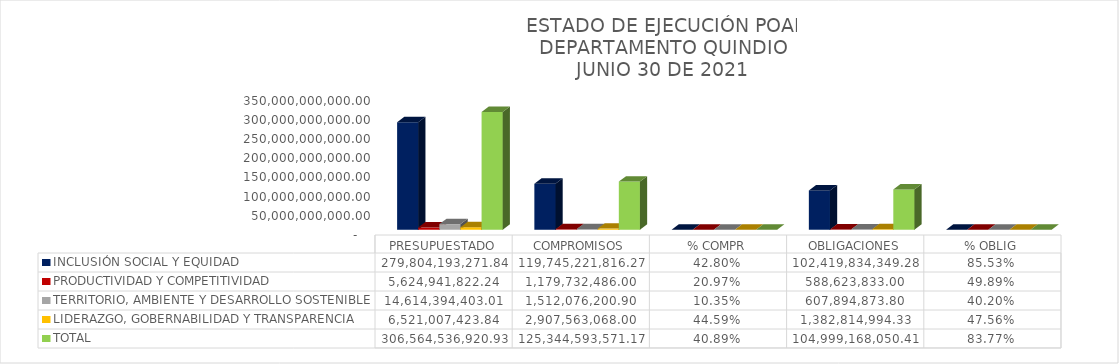
| Category | INCLUSIÓN SOCIAL Y EQUIDAD  | PRODUCTIVIDAD Y COMPETITIVIDAD | TERRITORIO, AMBIENTE Y DESARROLLO SOSTENIBLE  | LIDERAZGO, GOBERNABILIDAD Y TRANSPARENCIA  | TOTAL |
|---|---|---|---|---|---|
| PRESUPUESTADO | 279804193271.84 | 5624941822.24 | 14614394403.01 | 6521007423.84 | 306564536920.93 |
| COMPROMISOS | 119745221816.27 | 1179732486 | 1512076200.9 | 2907563068 | 125344593571.17 |
| % COMPR | 0.428 | 0.21 | 0.103 | 0.446 | 0.409 |
| OBLIGACIONES | 102419834349.28 | 588623833 | 607894873.8 | 1382814994.33 | 104999168050.41 |
| % OBLIG | 0.855 | 0.499 | 0.402 | 0.476 | 0.838 |